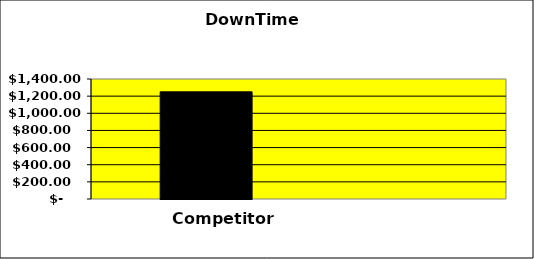
| Category | Series 0 | Series 1 | Series 2 |
|---|---|---|---|
| 0 | 1250 |  | 0 |